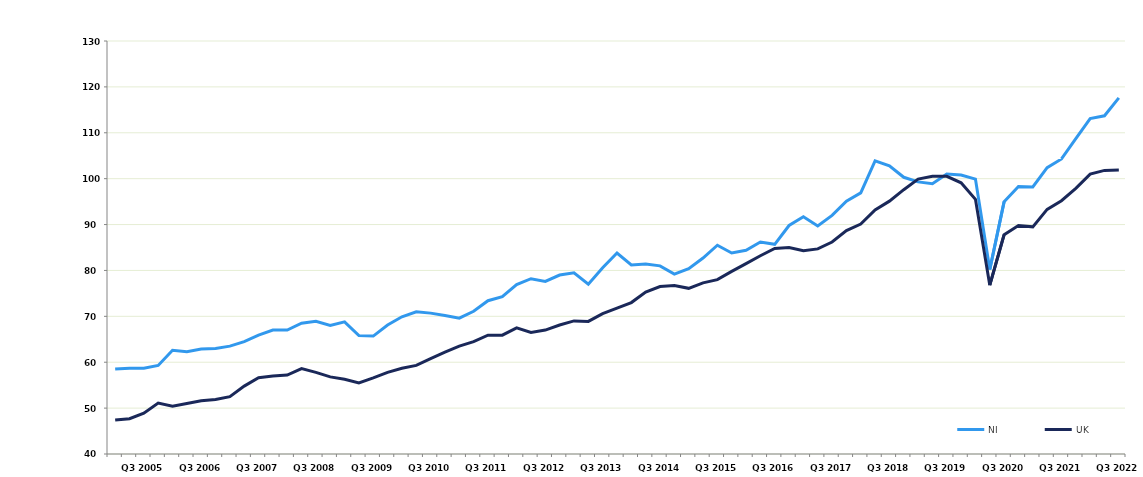
| Category | NI | UK |
|---|---|---|
|  | 58.5 | 47.4 |
|  | 58.7 | 47.7 |
| Q3 2005 | 58.7 | 48.9 |
|  | 59.3 | 51.1 |
|  | 62.6 | 50.4 |
|  | 62.3 | 51 |
| Q3 2006 | 62.9 | 51.6 |
|  | 63 | 51.9 |
|  | 63.5 | 52.5 |
|  | 64.5 | 54.8 |
| Q3 2007 | 65.9 | 56.6 |
|  | 67 | 57 |
|  | 67 | 57.2 |
|  | 68.5 | 58.6 |
| Q3 2008 | 68.9 | 57.8 |
|  | 68 | 56.8 |
|  | 68.8 | 56.3 |
|  | 65.8 | 55.5 |
| Q3 2009 | 65.7 | 56.6 |
|  | 68.1 | 57.8 |
|  | 69.9 | 58.7 |
|  | 71 | 59.3 |
| Q3 2010 | 70.7 | 60.8 |
|  | 70.2 | 62.2 |
|  | 69.6 | 63.5 |
|  | 71.1 | 64.5 |
| Q3 2011 | 73.4 | 65.9 |
|  | 74.3 | 65.9 |
|  | 76.9 | 67.5 |
|  | 78.2 | 66.5 |
| Q3 2012 | 77.6 | 67 |
|  | 79 | 68.1 |
|  | 79.5 | 69 |
|  | 77 | 68.9 |
| Q3 2013 | 80.6 | 70.6 |
|  | 83.8 | 71.8 |
|  | 81.2 | 73 |
|  | 81.4 | 75.3 |
| Q3 2014 | 81 | 76.5 |
|  | 79.2 | 76.7 |
|  | 80.4 | 76.1 |
|  | 82.7 | 77.3 |
| Q3 2015 | 85.5 | 78 |
|  | 83.8 | 79.8 |
|  | 84.4 | 81.5 |
|  | 86.2 | 83.2 |
| Q3 2016 | 85.7 | 84.8 |
|  | 89.8 | 85 |
|  | 91.7 | 84.3 |
|  | 89.7 | 84.7 |
| Q3 2017 | 92 | 86.2 |
|  | 95.1 | 88.7 |
|  | 96.9 | 90.1 |
|  | 103.9 | 93.2 |
| Q3 2018 | 102.8 | 95.1 |
|  | 100.3 | 97.6 |
|  | 99.3 | 99.9 |
|  | 98.9 | 100.5 |
| Q3 2019 | 101 | 100.5 |
|  | 100.8 | 99.1 |
|  | 99.9 | 95.5 |
|  | 80.2 | 76.8 |
| Q3 2020 | 95 | 87.8 |
|  | 98.3 | 89.8 |
|  | 98.2 | 89.5 |
|  | 102.4 | 93.3 |
| Q3 2021 | 104.3 | 95.2 |
|  | 108.7 | 97.9 |
|  | 113.1 | 101 |
|  | 113.7 | 101.8 |
| Q3 2022 | 117.6 | 101.9 |